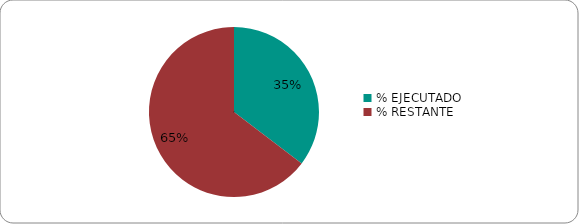
| Category | Series 0 |
|---|---|
| % EJECUTADO | 0.353 |
| % RESTANTE | 0.647 |